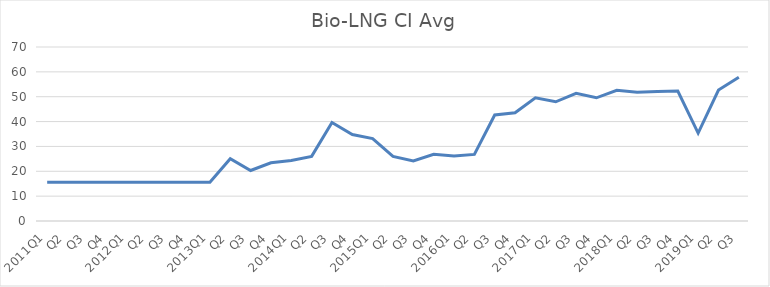
| Category | Bio-LNG CI Avg |
|---|---|
| 2011Q1 | 15.56 |
| Q2 | 15.56 |
| Q3 | 15.56 |
| Q4 | 15.56 |
| 2012Q1 | 15.56 |
| Q2 | 15.56 |
| Q3 | 15.56 |
| Q4 | 15.56 |
| 2013Q1 | 15.56 |
| Q2 | 25.06 |
| Q3 | 20.32 |
| Q4 | 23.42 |
| 2014Q1 | 24.31 |
| Q2 | 26 |
| Q3 | 39.65 |
| Q4 | 34.76 |
| 2015Q1 | 33.17 |
| Q2 | 25.96 |
| Q3 | 24.2 |
| Q4 | 26.86 |
| 2016Q1 | 26.17 |
| Q2 | 26.78 |
| Q3 | 42.66 |
| Q4 | 43.55 |
| 2017Q1 | 49.59 |
| Q2 | 47.97 |
| Q3 | 51.38 |
| Q4 | 49.57 |
| 2018Q1 | 52.59 |
| Q2 | 51.78 |
| Q3 | 52.1 |
| Q4 | 52.25 |
| 2019Q1 | 35.37 |
| Q2 | 52.69 |
| Q3 | 57.83 |